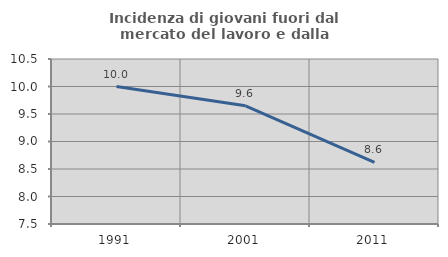
| Category | Incidenza di giovani fuori dal mercato del lavoro e dalla formazione  |
|---|---|
| 1991.0 | 10 |
| 2001.0 | 9.649 |
| 2011.0 | 8.621 |